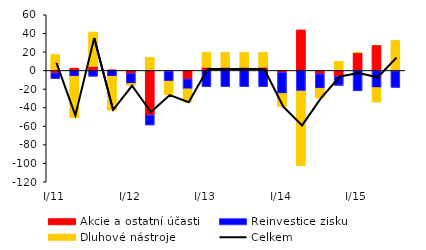
| Category | Akcie a ostatní účasti | Reinvestice zisku | Dluhové nástroje |
|---|---|---|---|
| I/11 | -2.569 | -6.291 | 17.255 |
| II | 2.527 | -6.291 | -44.364 |
| III | 4.362 | -6.291 | 37.132 |
| IV | 0.507 | -6.291 | -36.489 |
| I/12 | -3.253 | -10.785 | -2.251 |
| II | -48.016 | -10.785 | 14.16 |
| III | -0.777 | -10.785 | -14.771 |
| IV | -9.051 | -10.785 | -14.161 |
| I/13 | 3.515 | -17.551 | 15.896 |
| II | 3.515 | -17.551 | 15.896 |
| III | 3.515 | -17.551 | 15.896 |
| IV | 3.515 | -17.551 | 15.896 |
| I/14 | -2.088 | -22.755 | -13.843 |
| II | 43.736 | -22.199 | -80.565 |
| III | -3.51 | -15.748 | -10.404 |
| IV | -6.372 | -9.765 | 9.879 |
| I/15 | 19.073 | -21.986 | 0.416 |
| II | 26.914 | -18.494 | -15.581 |
| III | -0.506 | -17.814 | 32.345 |